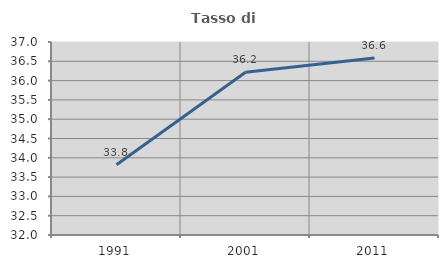
| Category | Tasso di occupazione   |
|---|---|
| 1991.0 | 33.822 |
| 2001.0 | 36.217 |
| 2011.0 | 36.585 |